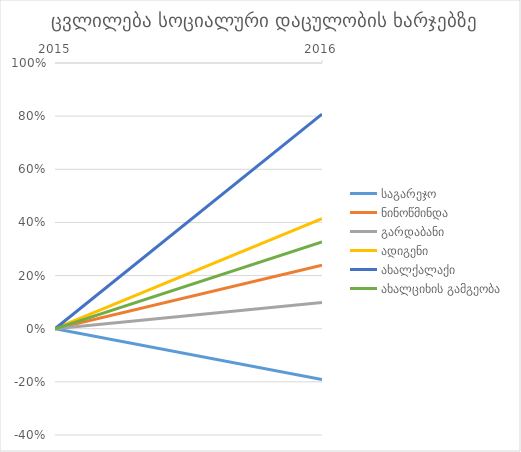
| Category | საგარეჯო | ნინოწმინდა | გარდაბანი | ადიგენი | ახალქალაქი | ახალციხის გამგეობა |
|---|---|---|---|---|---|---|
| 2015.0 | 0 | 0 | 0 | 0 | 0 | 0 |
| 2016.0 | -0.191 | 0.239 | 0.098 | 0.414 | 0.808 | 0.326 |